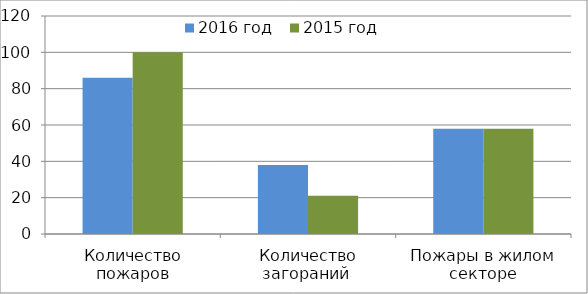
| Category | 2016 год | 2015 год |
|---|---|---|
| Количество пожаров | 86 | 100 |
| Количество загораний  | 38 | 21 |
| Пожары в жилом секторе | 58 | 58 |